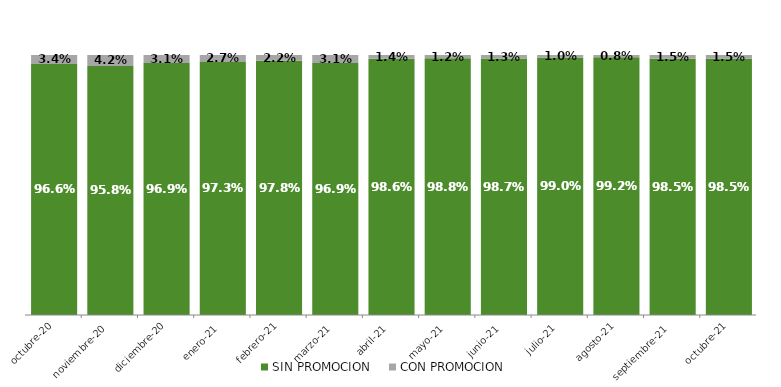
| Category | SIN PROMOCION   | CON PROMOCION   |
|---|---|---|
| 2020-10-01 | 0.966 | 0.034 |
| 2020-11-01 | 0.958 | 0.042 |
| 2020-12-01 | 0.969 | 0.031 |
| 2021-01-01 | 0.973 | 0.027 |
| 2021-02-01 | 0.978 | 0.022 |
| 2021-03-01 | 0.969 | 0.031 |
| 2021-04-01 | 0.986 | 0.014 |
| 2021-05-01 | 0.988 | 0.012 |
| 2021-06-01 | 0.987 | 0.013 |
| 2021-07-01 | 0.99 | 0.01 |
| 2021-08-01 | 0.992 | 0.008 |
| 2021-09-01 | 0.985 | 0.015 |
| 2021-10-01 | 0.985 | 0.015 |